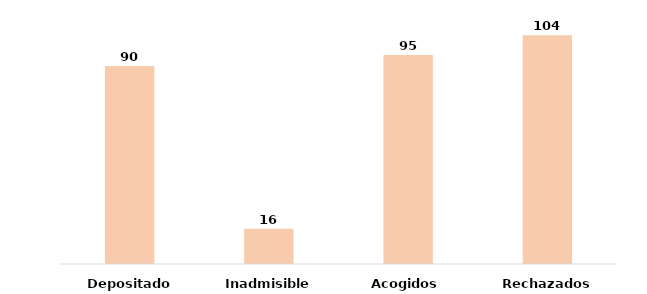
| Category | Series 0 |
|---|---|
| Depositados | 90 |
| Inadmisibles | 16 |
| Acogidos | 95 |
| Rechazados | 104 |